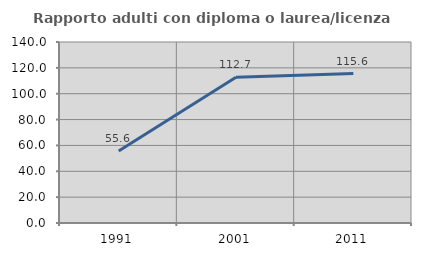
| Category | Rapporto adulti con diploma o laurea/licenza media  |
|---|---|
| 1991.0 | 55.645 |
| 2001.0 | 112.727 |
| 2011.0 | 115.603 |